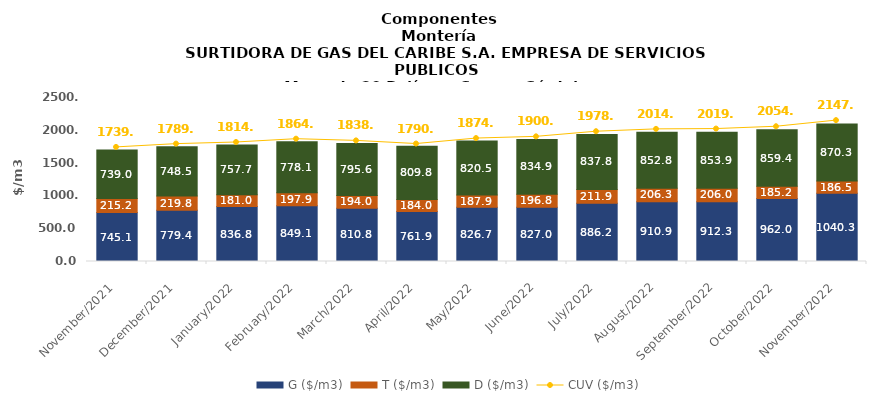
| Category | G ($/m3) | T ($/m3) | D ($/m3) |
|---|---|---|---|
| 2021-11-01 | 745.07 | 215.21 | 738.96 |
| 2021-12-01 | 779.43 | 219.79 | 748.5 |
| 2022-01-01 | 836.83 | 180.95 | 757.71 |
| 2022-02-01 | 849.08 | 197.89 | 778.12 |
| 2022-03-01 | 810.81 | 194.02 | 795.6 |
| 2022-04-01 | 761.86 | 183.95 | 809.75 |
| 2022-05-01 | 826.7 | 187.86 | 820.54 |
| 2022-06-01 | 827.01 | 196.82 | 834.92 |
| 2022-07-01 | 886.17 | 211.86 | 837.8 |
| 2022-08-01 | 910.91 | 206.26 | 852.79 |
| 2022-09-01 | 912.26 | 206.01 | 853.9 |
| 2022-10-01 | 962.02 | 185.17 | 859.36 |
| 2022-11-01 | 1040.34 | 186.54 | 870.26 |